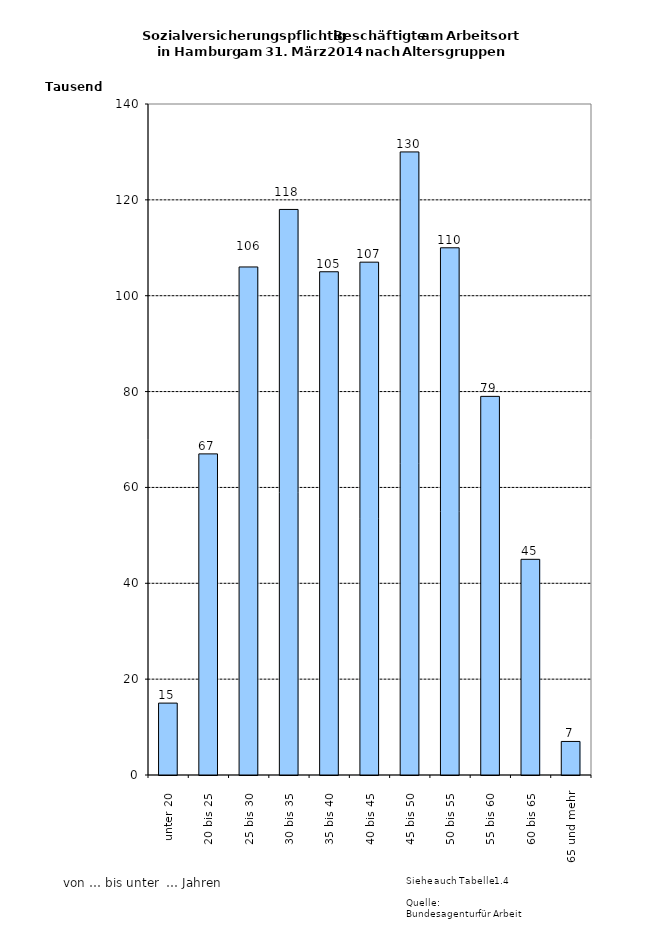
| Category | Series 0 |
|---|---|
| unter 20 | 15000 |
| 20 bis 25 | 67000 |
| 25 bis 30 | 106000 |
| 30 bis 35 | 118000 |
| 35 bis 40 | 105000 |
| 40 bis 45 | 107000 |
| 45 bis 50 | 130000 |
| 50 bis 55 | 110000 |
| 55 bis 60 | 79000 |
| 60 bis 65 | 45000 |
| 65 und mehr | 7000 |